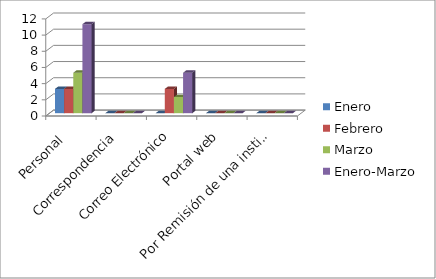
| Category | Enero | Febrero | Marzo | Enero-Marzo |
|---|---|---|---|---|
| Personal  | 3 | 3 | 5 | 11 |
| Correspondencia | 0 | 0 | 0 | 0 |
| Correo Electrónico | 0 | 3 | 2 | 5 |
| Portal web | 0 | 0 | 0 | 0 |
| Por Remisión de una institución | 0 | 0 | 0 | 0 |